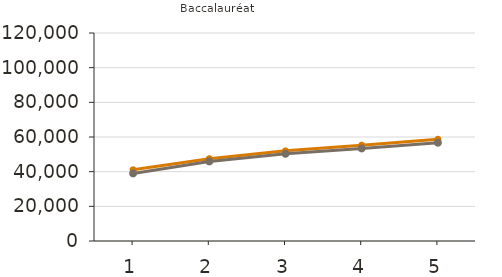
| Category | Moyens | Médians |
|---|---|---|
| 1.0 | 41100 | 39000 |
| 2.0 | 47500 | 45900 |
| 3.0 | 52000 | 50300 |
| 4.0 | 55300 | 53400 |
| 5.0 | 58700 | 56700 |